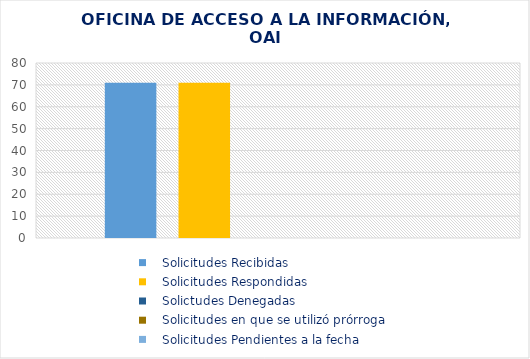
| Category |    Solicitudes Recibidas |    Solicitudes Respondidas |    Solictudes Denegadas |    Solicitudes en que se utilizó prórroga |    Solicitudes Pendientes a la fecha |
|---|---|---|---|---|---|
| 0 | 71 | 71 | 0 | 0 | 0 |